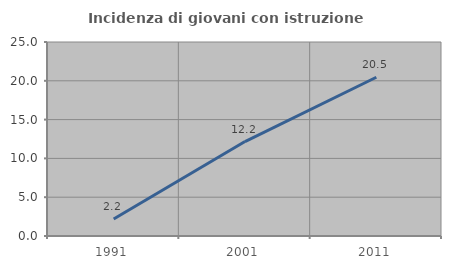
| Category | Incidenza di giovani con istruzione universitaria |
|---|---|
| 1991.0 | 2.198 |
| 2001.0 | 12.174 |
| 2011.0 | 20.455 |